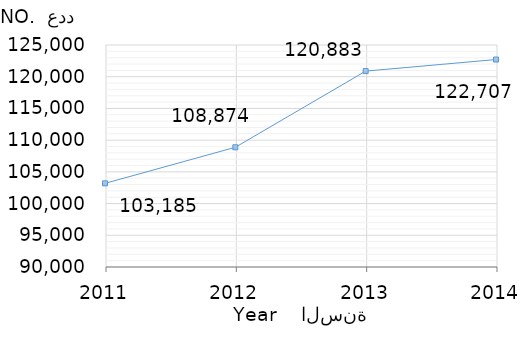
| Category | القيمة
Value |
|---|---|
| 2014.0 | 122707 |
| 2013.0 | 120883 |
| 2012.0 | 108874 |
| 2011.0 | 103185 |